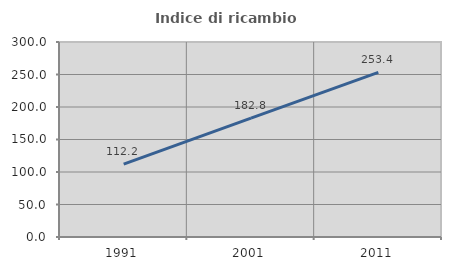
| Category | Indice di ricambio occupazionale  |
|---|---|
| 1991.0 | 112.194 |
| 2001.0 | 182.773 |
| 2011.0 | 253.362 |